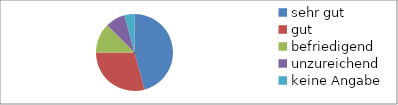
| Category | Series 0 |
|---|---|
| sehr gut | 11 |
| gut | 7 |
| befriedigend | 3 |
| unzureichend | 2 |
| keine Angabe | 1 |